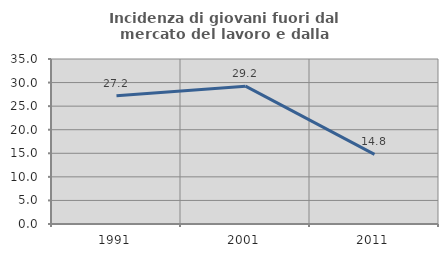
| Category | Incidenza di giovani fuori dal mercato del lavoro e dalla formazione  |
|---|---|
| 1991.0 | 27.214 |
| 2001.0 | 29.241 |
| 2011.0 | 14.769 |